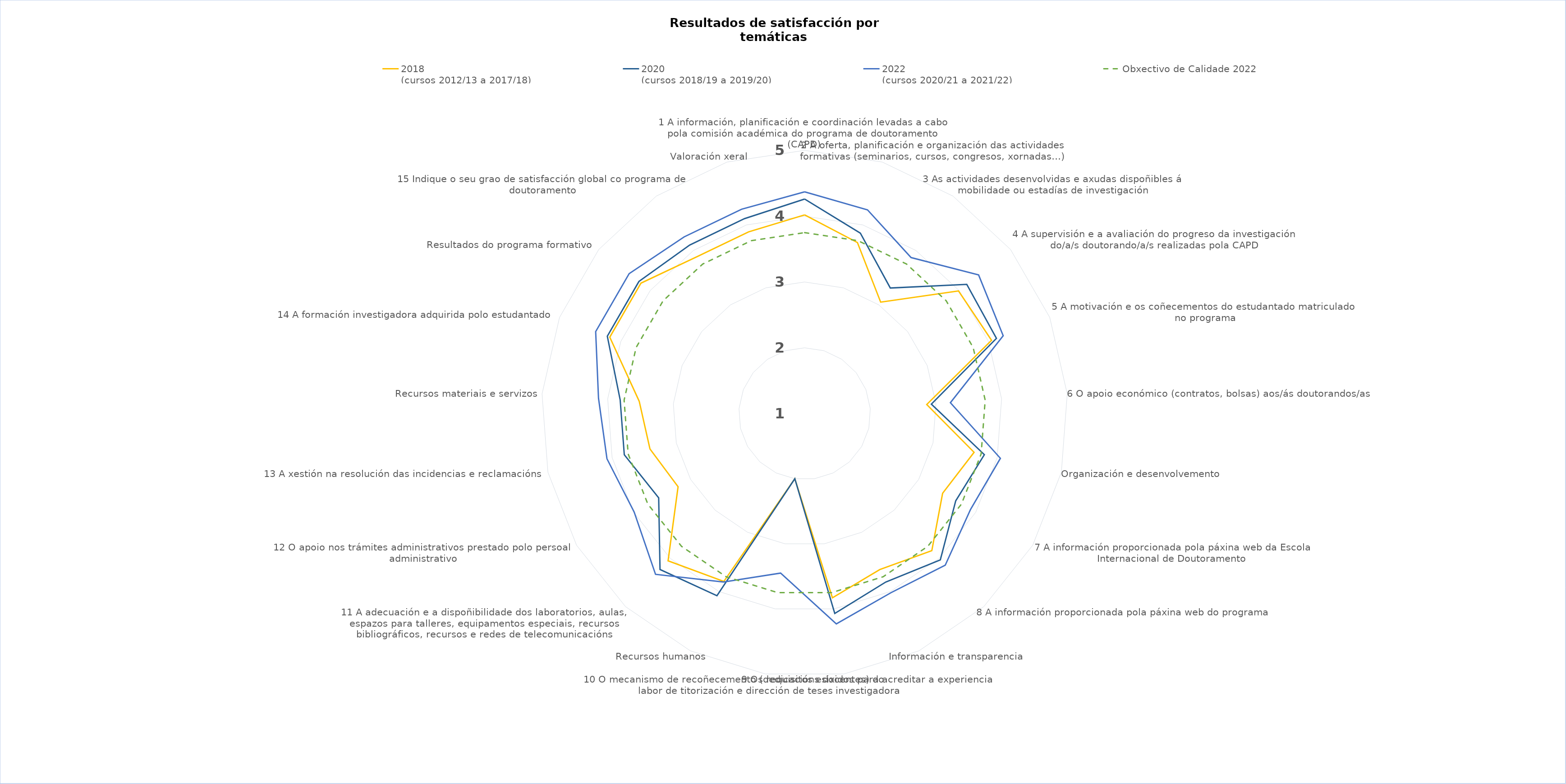
| Category | 2018
(cursos 2012/13 a 2017/18) | 2020
(cursos 2018/19 a 2019/20) | 2022
(cursos 2020/21 a 2021/22) | Obxectivo de Calidade 2022 |
|---|---|---|---|---|
| 1 A información, planificación e coordinación levadas a cabo pola comisión académica do programa de doutoramento (CAPD) | 4.02 | 4.26 | 4.37 | 3.75 |
| 2 A oferta, planificación e organización das actividades formativas (seminarios, cursos, congresos, xornadas…) | 3.72 | 3.87 | 4.24 | 3.75 |
| 3 As actividades desenvolvidas e axudas dispoñibles á mobilidade ou estadías de investigación | 3.05 | 3.31 | 3.87 | 3.75 |
| 4 A supervisión e a avaliación do progreso da investigación do/a/s doutorando/a/s realizadas pola CAPD | 3.99 | 4.15 | 4.38 | 3.75 |
| 5 A motivación e os coñecementos do estudantado matriculado no programa | 4.05 | 4.13 | 4.24 | 3.75 |
| 6 O apoio económico (contratos, bolsas) aos/ás doutorandos/as | 2.86 | 2.93 | 3.22 | 3.75 |
| Organización e desenvolvemento | 3.64 | 3.8 | 4.05 | 3.75 |
| 7 A información proporcionada pola páxina web da Escola Internacional de Doutoramento  | 3.42 | 3.65 | 3.91 | 3.75 |
| 8 A información proporcionada pola páxina web do programa | 3.84 | 4.03 | 4.14 | 3.75 |
| Información e transparencia | 3.63 | 3.84 | 4.02 | 3.75 |
| 9 Os requisitos esixidos para acreditar a experiencia investigadora | 3.83 | 4.07 | 4.23 | 3.75 |
| 10 O mecanismo de recoñecemento (dedicacións docentes) do labor de titorización e dirección de teses | 0 | 0 | 3.45 | 3.75 |
| Recursos humanos | 3.83 | 4.07 | 3.84 | 3.75 |
| 11 A adecuación e a dispoñibilidade dos laboratorios, aulas, espazos para talleres, equipamentos especiais, recursos bibliográficos, recursos e redes de telecomunicacións | 4.05 | 4.23 | 4.33 | 3.75 |
| 12 O apoio nos trámites administrativos prestado polo persoal administrativo | 3.22 | 3.56 | 3.99 | 3.75 |
| 13 A xestión na resolución das incidencias e reclamacións | 3.41 | 3.81 | 4.08 | 3.75 |
| Recursos materiais e servizos | 3.52 | 3.81 | 4.14 | 3.75 |
| 14 A formación investigadora adquirida polo estudantado | 4.18 | 4.22 | 4.41 | 3.75 |
| Resultados do programa formativo | 4.18 | 4.22 | 4.41 | 3.75 |
| 15 Indique o seu grao de satisfacción global co programa de doutoramento | 3.89 | 4.1 | 4.25 | 3.75 |
| Valoración xeral | 3.89 | 4.1 | 4.25 | 3.75 |